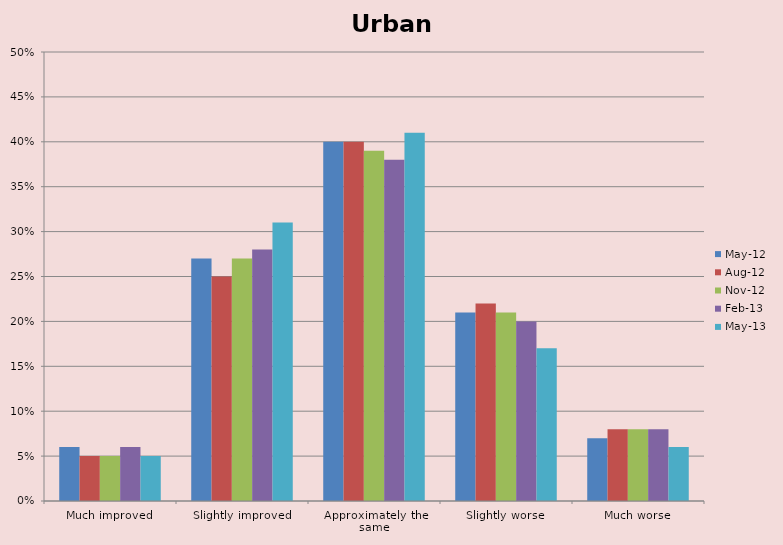
| Category | May-12 | Aug-12 | Nov-12 | Feb-13 | May-13 |
|---|---|---|---|---|---|
| Much improved | 0.06 | 0.05 | 0.05 | 0.06 | 0.05 |
| Slightly improved | 0.27 | 0.25 | 0.27 | 0.28 | 0.31 |
| Approximately the same | 0.4 | 0.4 | 0.39 | 0.38 | 0.41 |
| Slightly worse | 0.21 | 0.22 | 0.21 | 0.2 | 0.17 |
| Much worse | 0.07 | 0.08 | 0.08 | 0.08 | 0.06 |